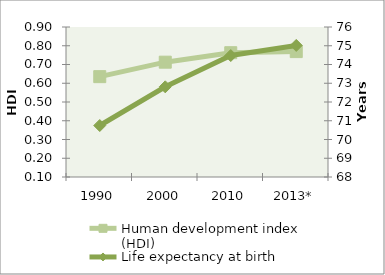
| Category | Human development index (HDI) |
|---|---|
| 1990 | 0.635 |
| 2000 | 0.712 |
| 2010 | 0.763 |
| 2013* | 0.769 |